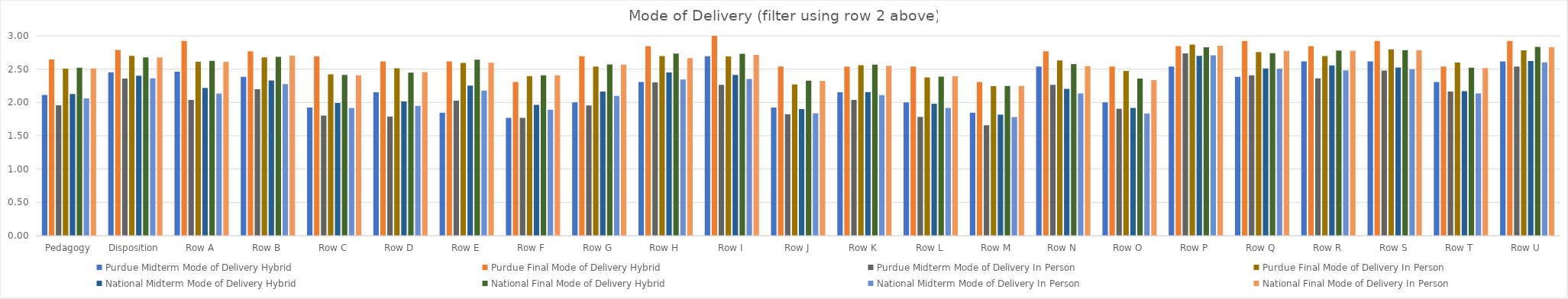
| Category | Purdue | National |
|---|---|---|
| Pedagogy | 2.507 | 2.511 |
| Disposition | 2.701 | 2.677 |
| Row A | 2.612 | 2.61 |
| Row B | 2.678 | 2.702 |
| Row C | 2.421 | 2.408 |
| Row D | 2.513 | 2.456 |
| Row E | 2.592 | 2.597 |
| Row F | 2.395 | 2.407 |
| Row G | 2.54 | 2.566 |
| Row H | 2.697 | 2.666 |
| Row I | 2.691 | 2.715 |
| Row J | 2.27 | 2.324 |
| Row K | 2.559 | 2.551 |
| Row L | 2.375 | 2.392 |
| Row M | 2.243 | 2.247 |
| Row N | 2.632 | 2.545 |
| Row O | 2.474 | 2.337 |
| Row P | 2.868 | 2.852 |
| Row Q | 2.757 | 2.775 |
| Row R | 2.697 | 2.776 |
| Row S | 2.796 | 2.785 |
| Row T | 2.599 | 2.517 |
| Row U | 2.783 | 2.828 |